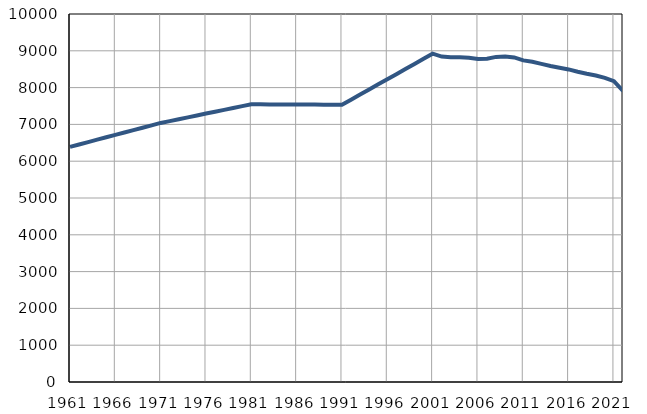
| Category | Број
становника |
|---|---|
| 1961.0 | 6390 |
| 1962.0 | 6455 |
| 1963.0 | 6520 |
| 1964.0 | 6585 |
| 1965.0 | 6650 |
| 1966.0 | 6715 |
| 1967.0 | 6780 |
| 1968.0 | 6845 |
| 1969.0 | 6910 |
| 1970.0 | 6975 |
| 1971.0 | 7040 |
| 1972.0 | 7090 |
| 1973.0 | 7141 |
| 1974.0 | 7192 |
| 1975.0 | 7243 |
| 1976.0 | 7294 |
| 1977.0 | 7345 |
| 1978.0 | 7395 |
| 1979.0 | 7445 |
| 1980.0 | 7496 |
| 1981.0 | 7547 |
| 1982.0 | 7546 |
| 1983.0 | 7544 |
| 1984.0 | 7543 |
| 1985.0 | 7542 |
| 1986.0 | 7541 |
| 1987.0 | 7539 |
| 1988.0 | 7538 |
| 1989.0 | 7537 |
| 1990.0 | 7535 |
| 1991.0 | 7534 |
| 1992.0 | 7673 |
| 1993.0 | 7811 |
| 1994.0 | 7950 |
| 1995.0 | 8089 |
| 1996.0 | 8228 |
| 1997.0 | 8366 |
| 1998.0 | 8505 |
| 1999.0 | 8644 |
| 2000.0 | 8783 |
| 2001.0 | 8921 |
| 2002.0 | 8844 |
| 2003.0 | 8827 |
| 2004.0 | 8824 |
| 2005.0 | 8809 |
| 2006.0 | 8776 |
| 2007.0 | 8782 |
| 2008.0 | 8834 |
| 2009.0 | 8845 |
| 2010.0 | 8819 |
| 2011.0 | 8739 |
| 2012.0 | 8700 |
| 2013.0 | 8645 |
| 2014.0 | 8588 |
| 2015.0 | 8541 |
| 2016.0 | 8494 |
| 2017.0 | 8431 |
| 2018.0 | 8376 |
| 2019.0 | 8330 |
| 2020.0 | 8265 |
| 2021.0 | 8173 |
| 2022.0 | 7908 |